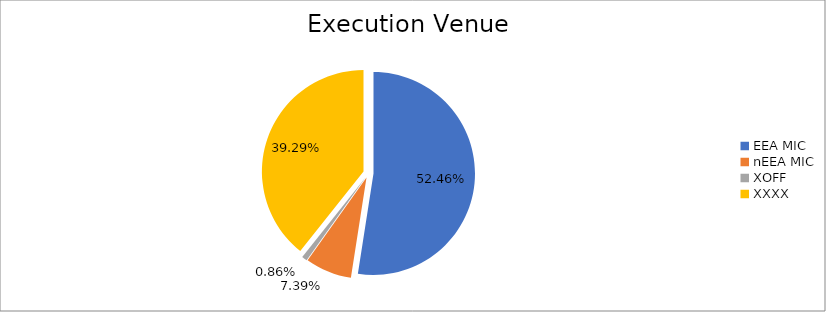
| Category | Series 0 |
|---|---|
| EEA MIC | 6834779.241 |
| nEEA MIC | 963129.176 |
| XOFF | 112038.851 |
| XXXX | 5119236.346 |